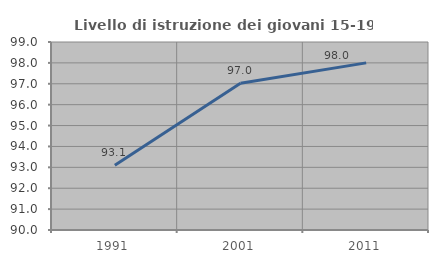
| Category | Livello di istruzione dei giovani 15-19 anni |
|---|---|
| 1991.0 | 93.103 |
| 2001.0 | 97.03 |
| 2011.0 | 98 |